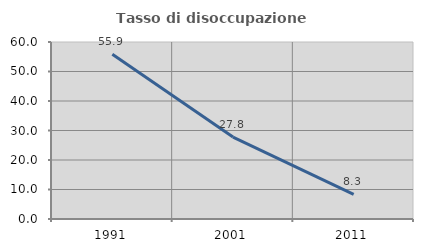
| Category | Tasso di disoccupazione giovanile  |
|---|---|
| 1991.0 | 55.882 |
| 2001.0 | 27.778 |
| 2011.0 | 8.333 |